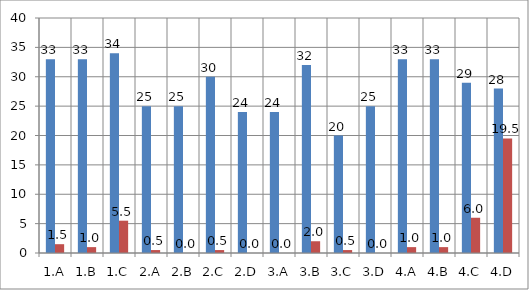
| Category | Series 0 | Series 1 |
|---|---|---|
| 1.A | 33 | 1.5 |
| 1.B | 33 | 1 |
| 1.C | 34 | 5.5 |
| 2.A | 25 | 0.5 |
| 2.B | 25 | 0 |
| 2.C | 30 | 0.5 |
| 2.D | 24 | 0 |
| 3.A | 24 | 0 |
| 3.B | 32 | 2 |
| 3.C | 20 | 0.5 |
| 3.D | 25 | 0 |
| 4.A | 33 | 1 |
| 4.B | 33 | 1 |
| 4.C | 29 | 6 |
| 4.D | 28 | 19.5 |